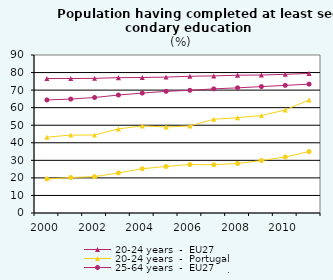
| Category | 20-24 years  -  EU27 | 20-24 years  -  Portugal | 25-64 years  -  EU27 | 25-64 years  -  Portugal |
|---|---|---|---|---|
| 2000.0 | 76.6 | 43.2 | 64.4 | 19.4 |
| 2001.0 | 76.6 | 44.4 | 64.9 | 20.2 |
| 2002.0 | 76.7 | 44.4 | 65.8 | 20.7 |
| 2003.0 | 77.1 | 47.9 | 67.2 | 22.8 |
| 2004.0 | 77.2 | 49.6 | 68.3 | 25.2 |
| 2005.0 | 77.4 | 49 | 69.3 | 26.5 |
| 2006.0 | 77.9 | 49.6 | 69.9 | 27.6 |
| 2007.0 | 78.1 | 53.4 | 70.7 | 27.5 |
| 2008.0 | 78.5 | 54.3 | 71.3 | 28.2 |
| 2009.0 | 78.6 | 55.5 | 72 | 29.9 |
| 2010.0 | 79 | 58.7 | 72.7 | 31.9 |
| 2011.0 | 79.5 | 64.4 | 73.4 | 35 |